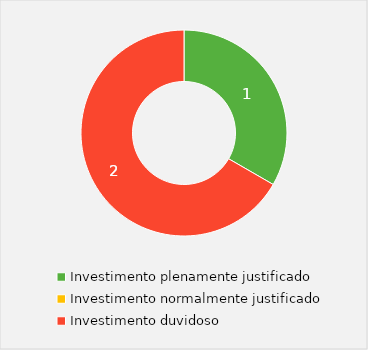
| Category | Valor |
|---|---|
| Investimento plenamente justificado | 1 |
| Investimento normalmente justificado | 0 |
| Investimento duvidoso | 2 |